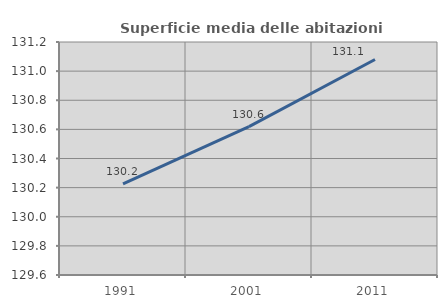
| Category | Superficie media delle abitazioni occupate |
|---|---|
| 1991.0 | 130.225 |
| 2001.0 | 130.619 |
| 2011.0 | 131.08 |